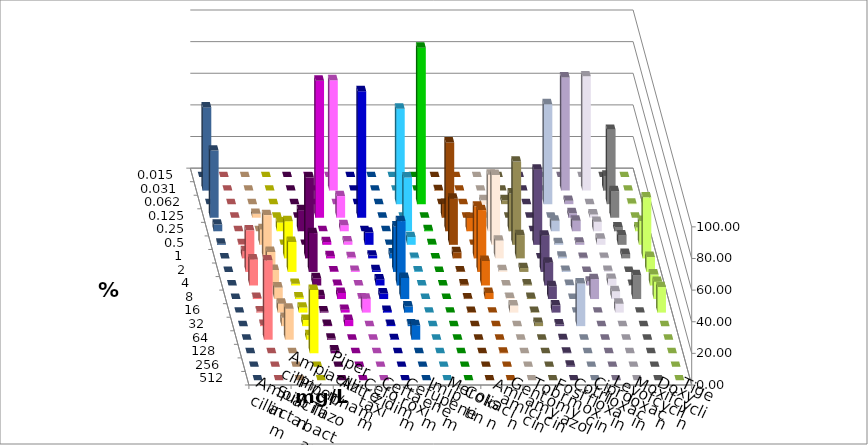
| Category | Ampicillin | Ampicillin/ Sulbactam | Piperacillin | Piperacillin/ Tazobactam | Aztreonam | Cefotaxim | Ceftazidim | Cefuroxim | Imipenem | Meropenem | Colistin | Amikacin | Gentamicin | Tobramycin | Fosfomycin | Cotrimoxazol | Ciprofloxacin | Levofloxacin | Moxifloxacin | Doxycyclin | Tigecyclin |
|---|---|---|---|---|---|---|---|---|---|---|---|---|---|---|---|---|---|---|---|---|---|
| 0.015 | 0 | 0 | 0 | 0 | 0 | 0 | 0 | 0 | 0 | 0 | 0 | 0 | 0 | 0 | 0 | 0 | 0 | 0 | 0 | 0 | 0 |
| 0.031 | 0 | 0 | 0 | 0 | 0 | 69.825 | 0 | 0 | 0 | 0 | 0.351 | 0 | 0 | 0 | 0 | 0 | 71.579 | 72.281 | 9.474 | 0 | 52.632 |
| 0.062 | 0 | 0 | 0 | 0 | 0 | 0 | 0 | 0 | 60.351 | 98.947 | 0 | 0 | 2.456 | 2.456 | 0 | 63.158 | 2.105 | 0 | 47.018 | 0.351 | 0 |
| 0.125 | 0 | 2.456 | 0 | 0 | 86.667 | 13.684 | 80 | 0 | 0 | 0 | 8.772 | 0 | 0 | 0 | 0 | 0 | 2.807 | 2.105 | 16.842 | 0 | 42.456 |
| 0.25 | 0 | 0 | 5.614 | 13.333 | 0 | 3.86 | 0 | 0 | 34.035 | 0.702 | 56.14 | 8.451 | 35.789 | 23.86 | 0 | 6.667 | 6.667 | 5.965 | 2.456 | 2.456 | 4.211 |
| 0.5 | 0.351 | 9.825 | 0 | 0 | 1.754 | 2.105 | 7.719 | 0 | 4.912 | 0.351 | 29.123 | 0 | 44.211 | 52.632 | 47.535 | 1.053 | 1.404 | 3.86 | 5.965 | 15.088 | 0.702 |
| 1.0 | 4.561 | 27.368 | 23.509 | 51.228 | 1.404 | 0.702 | 1.754 | 3.158 | 0.351 | 0 | 3.86 | 32.746 | 11.228 | 14.737 | 0 | 1.053 | 0.351 | 0.351 | 2.807 | 38.596 | 0 |
| 2.0 | 26.316 | 12.632 | 18.947 | 24.561 | 0.351 | 0.702 | 1.053 | 28.772 | 0.351 | 0 | 0.351 | 39.085 | 1.053 | 2.456 | 22.887 | 0.702 | 0 | 0.702 | 0 | 9.474 | 0 |
| 4.0 | 16.491 | 9.825 | 1.053 | 4.561 | 0.351 | 0 | 3.86 | 40.702 | 0 | 0 | 0.702 | 15.493 | 0 | 0.702 | 14.437 | 0.351 | 2.456 | 4.211 | 0.351 | 7.018 | 0 |
| 8.0 | 0.702 | 7.368 | 1.053 | 2.456 | 3.86 | 0.351 | 3.509 | 13.333 | 0 | 0 | 0.351 | 3.873 | 0.702 | 0.702 | 8.099 | 0 | 12.632 | 4.912 | 15.088 | 10.877 | 0 |
| 16.0 | 0.702 | 5.614 | 3.158 | 0.702 | 1.754 | 8.772 | 1.053 | 3.86 | 0 | 0 | 0.351 | 0 | 4.561 | 0.351 | 4.577 | 0 | 0 | 5.614 | 0 | 16.14 | 0 |
| 32.0 | 0.702 | 5.263 | 3.86 | 0.702 | 3.86 | 0 | 0.702 | 1.053 | 0 | 0 | 0 | 0 | 0 | 2.105 | 1.056 | 27.018 | 0 | 0 | 0 | 0 | 0 |
| 64.0 | 50.175 | 19.649 | 2.807 | 0.702 | 0 | 0 | 0.351 | 9.123 | 0 | 0 | 0 | 0 | 0 | 0 | 0.352 | 0 | 0 | 0 | 0 | 0 | 0 |
| 128.0 | 0 | 0 | 40 | 1.754 | 0 | 0 | 0 | 0 | 0 | 0 | 0 | 0.352 | 0 | 0 | 0.352 | 0 | 0 | 0 | 0 | 0 | 0 |
| 256.0 | 0 | 0 | 0 | 0 | 0 | 0 | 0 | 0 | 0 | 0 | 0 | 0 | 0 | 0 | 0.704 | 0 | 0 | 0 | 0 | 0 | 0 |
| 512.0 | 0 | 0 | 0 | 0 | 0 | 0 | 0 | 0 | 0 | 0 | 0 | 0 | 0 | 0 | 0 | 0 | 0 | 0 | 0 | 0 | 0 |